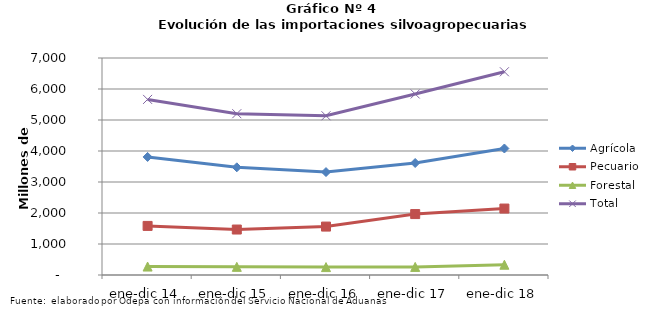
| Category | Agrícola | Pecuario | Forestal | Total |
|---|---|---|---|---|
| ene-dic 14 | 3808241 | 1583623 | 272603 | 5664467 |
| ene-dic 15 | 3474061 | 1466730 | 262751 | 5203542 |
| ene-dic 16 | 3320129 | 1561996 | 254803 | 5136928 |
| ene-dic 17 | 3613241 | 1965514 | 260608 | 5839363 |
| ene-dic 18 | 4080730 | 2143392 | 331463 | 6555585 |